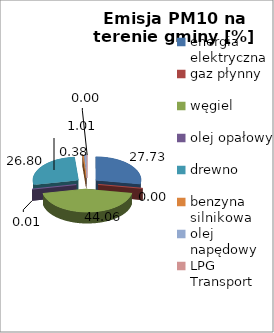
| Category | 27,73 0,00 44,06 0,01 26,80 0,38 1,01 0,00 |
|---|---|
| energia elektryczna | 27.73 |
| gaz płynny | 0.003 |
| węgiel | 44.063 |
| olej opałowy | 0.009 |
| drewno | 26.805 |
| benzyna silnikowa | 0.376 |
| olej napędowy | 1.014 |
| LPG Transport | 0 |